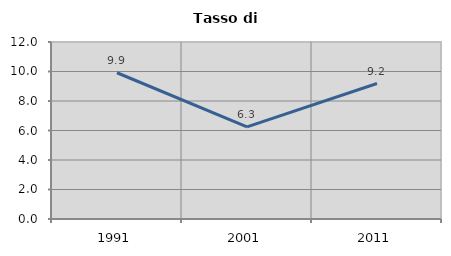
| Category | Tasso di disoccupazione   |
|---|---|
| 1991.0 | 9.915 |
| 2001.0 | 6.25 |
| 2011.0 | 9.186 |